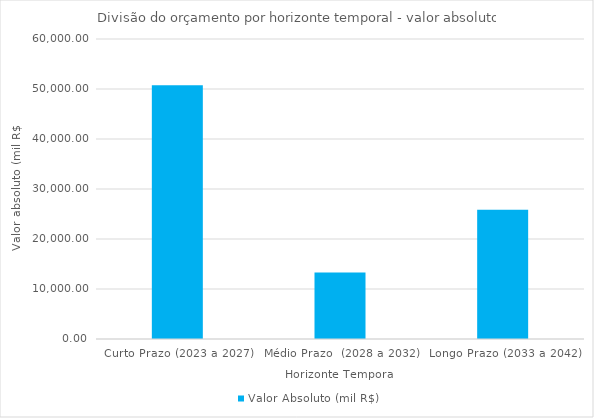
| Category | Valor Absoluto (mil R$) |
|---|---|
| Curto Prazo (2023 a 2027) | 50735.264 |
| Médio Prazo  (2028 a 2032) | 13298.772 |
| Longo Prazo (2033 a 2042) | 25844.777 |